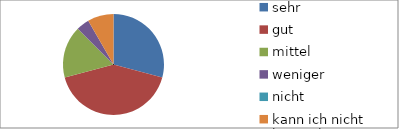
| Category | Series 0 |
|---|---|
| sehr | 7 |
| gut | 10 |
| mittel | 4 |
| weniger | 1 |
| nicht | 0 |
| kann ich nicht beurteilen | 2 |
| keine Angabe | 0 |